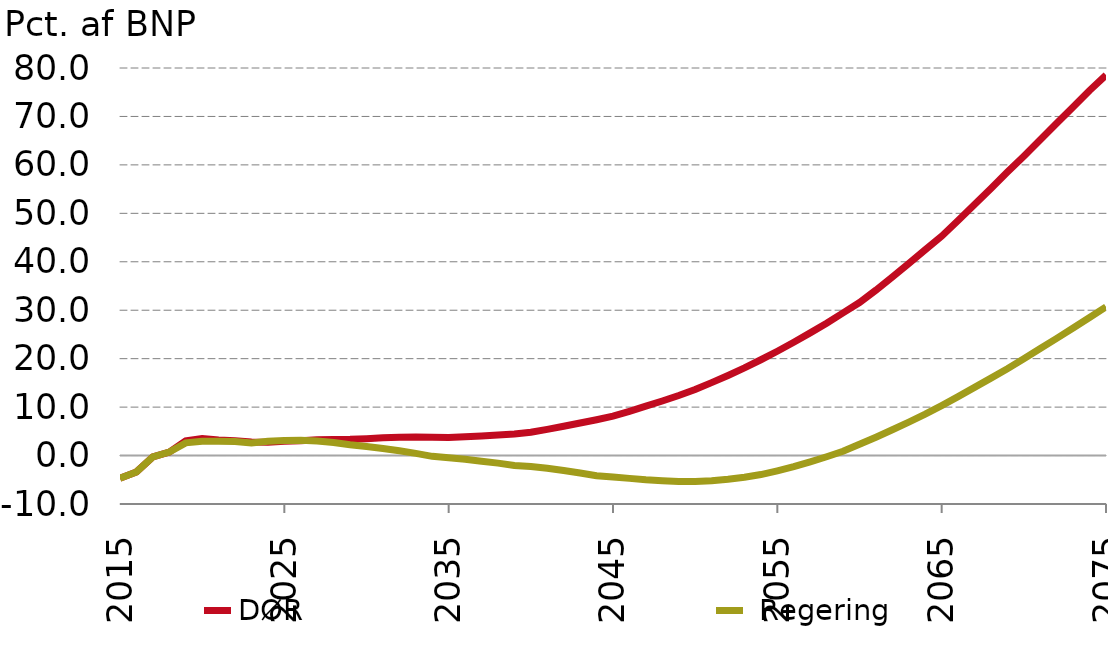
| Category | nullinje | DØR |  Regering |
|---|---|---|---|
| 2015-01-01 | 0 | -4.666 | -4.666 |
| 2016-01-01 | 0 | -3.38 | -3.38 |
| 2017-01-01 | 0 | -0.265 | -0.265 |
| 2018-01-01 | 0 | 0.719 | 0.719 |
| 2019-01-01 | 0 | 3.021 | 2.617 |
| 2020-01-01 | 0 | 3.5 | 2.959 |
| 2021-01-01 | 0 | 3.222 | 2.953 |
| 2022-01-01 | 0 | 3.032 | 2.906 |
| 2023-01-01 | 0 | 2.794 | 2.611 |
| 2024-01-01 | 0 | 2.747 | 2.932 |
| 2025-01-01 | 0 | 2.937 | 3.086 |
| 2026-01-01 | 0 | 3.065 | 3.161 |
| 2027-01-01 | 0 | 3.238 | 3.003 |
| 2028-01-01 | 0 | 3.338 | 2.709 |
| 2029-01-01 | 0 | 3.369 | 2.243 |
| 2030-01-01 | 0 | 3.487 | 1.88 |
| 2031-01-01 | 0 | 3.674 | 1.472 |
| 2032-01-01 | 0 | 3.797 | 0.987 |
| 2033-01-01 | 0 | 3.839 | 0.451 |
| 2034-01-01 | 0 | 3.754 | -0.161 |
| 2035-01-01 | 0 | 3.706 | -0.458 |
| 2036-01-01 | 0 | 3.883 | -0.769 |
| 2037-01-01 | 0 | 4.056 | -1.162 |
| 2038-01-01 | 0 | 4.235 | -1.566 |
| 2039-01-01 | 0 | 4.447 | -2.031 |
| 2040-01-01 | 0 | 4.804 | -2.249 |
| 2041-01-01 | 0 | 5.408 | -2.61 |
| 2042-01-01 | 0 | 6.049 | -3.075 |
| 2043-01-01 | 0 | 6.729 | -3.596 |
| 2044-01-01 | 0 | 7.401 | -4.152 |
| 2045-01-01 | 0 | 8.147 | -4.421 |
| 2046-01-01 | 0 | 9.14 | -4.712 |
| 2047-01-01 | 0 | 10.186 | -4.998 |
| 2048-01-01 | 0 | 11.267 | -5.208 |
| 2049-01-01 | 0 | 12.401 | -5.378 |
| 2050-01-01 | 0 | 13.625 | -5.34 |
| 2051-01-01 | 0 | 15.051 | -5.181 |
| 2052-01-01 | 0 | 16.539 | -4.889 |
| 2053-01-01 | 0 | 18.098 | -4.471 |
| 2054-01-01 | 0 | 19.774 | -3.926 |
| 2055-01-01 | 0 | 21.53 | -3.151 |
| 2056-01-01 | 0 | 23.38 | -2.299 |
| 2057-01-01 | 0 | 25.317 | -1.305 |
| 2058-01-01 | 0 | 27.331 | -0.242 |
| 2059-01-01 | 0 | 29.452 | 0.888 |
| 2060-01-01 | 0 | 31.593 | 2.325 |
| 2061-01-01 | 0 | 34.148 | 3.795 |
| 2062-01-01 | 0 | 36.864 | 5.33 |
| 2063-01-01 | 0 | 39.636 | 6.913 |
| 2064-01-01 | 0 | 42.475 | 8.533 |
| 2065-01-01 | 0 | 45.287 | 10.32 |
| 2066-01-01 | 0 | 48.509 | 12.178 |
| 2067-01-01 | 0 | 51.819 | 14.063 |
| 2068-01-01 | 0 | 55.149 | 15.976 |
| 2069-01-01 | 0 | 58.525 | 17.92 |
| 2070-01-01 | 0 | 61.783 | 19.987 |
| 2071-01-01 | 0 | 65.177 | 22.079 |
| 2072-01-01 | 0 | 68.604 | 24.194 |
| 2073-01-01 | 0 | 71.956 | 26.337 |
| 2074-01-01 | 0 | 75.372 | 28.486 |
| 2075-01-01 | 0 | 78.532 | 30.702 |